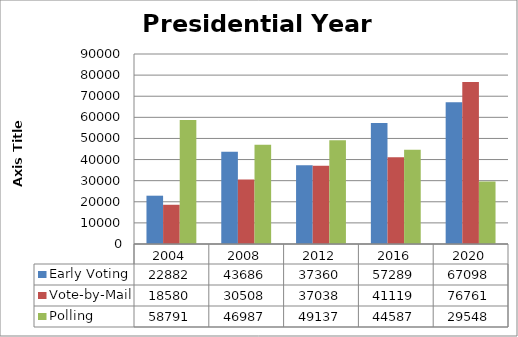
| Category | Early Voting | Vote-by-Mail | Polling |
|---|---|---|---|
| 2004.0 | 22882 | 18580 | 58791 |
| 2008.0 | 43686 | 30508 | 46987 |
| 2012.0 | 37360 | 37038 | 49137 |
| 2016.0 | 57289 | 41119 | 44587 |
| 2020.0 | 67098 | 76761 | 29548 |